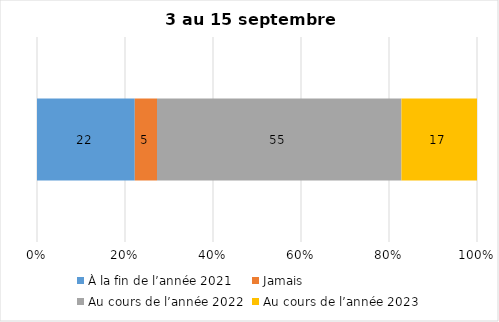
| Category | À la fin de l’année 2021 | Jamais | Au cours de l’année 2022 | Au cours de l’année 2023 |
|---|---|---|---|---|
| 0 | 22 | 5 | 55 | 17 |